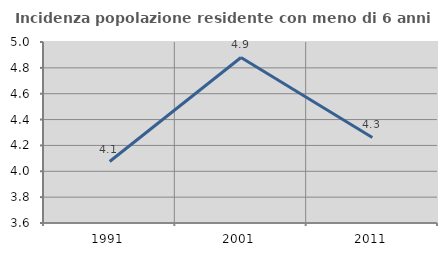
| Category | Incidenza popolazione residente con meno di 6 anni |
|---|---|
| 1991.0 | 4.076 |
| 2001.0 | 4.88 |
| 2011.0 | 4.261 |